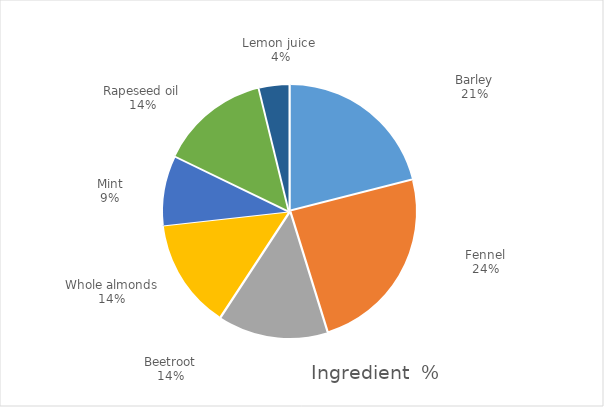
| Category | Amount grams |
|---|---|
| Barley | 33 |
| Fennel | 38 |
| Beetroot | 22 |
| Whole almonds | 22 |
| Mint | 14 |
| Rapeseed oil | 22 |
| Lemon juice  | 6 |